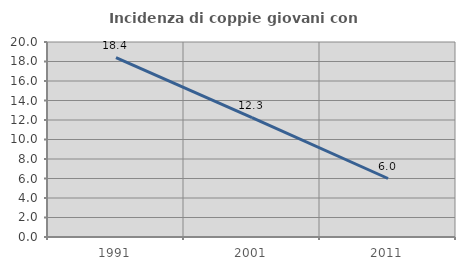
| Category | Incidenza di coppie giovani con figli |
|---|---|
| 1991.0 | 18.392 |
| 2001.0 | 12.251 |
| 2011.0 | 6 |